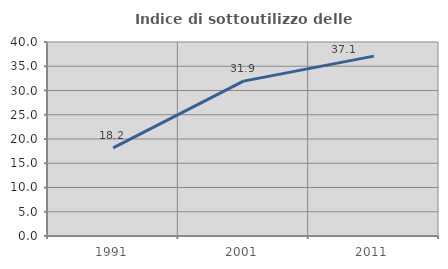
| Category | Indice di sottoutilizzo delle abitazioni  |
|---|---|
| 1991.0 | 18.186 |
| 2001.0 | 31.931 |
| 2011.0 | 37.088 |